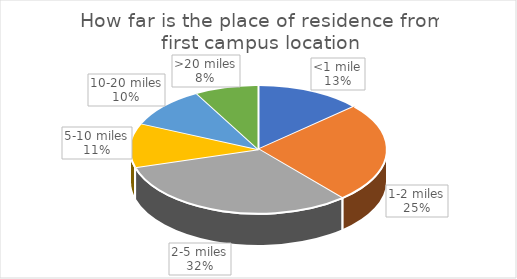
| Category | Series 0 |
|---|---|
| <1 mile | 35 |
| 1-2 miles | 66 |
| 2-5 miles | 83 |
| 5-10 miles | 29 |
| 10-20 miles | 27 |
| >20 miles | 21 |